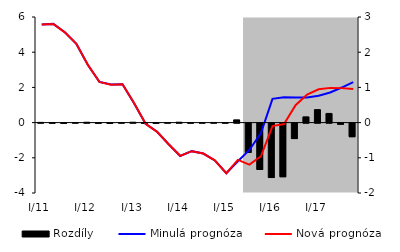
| Category | Rozdíly |
|---|---|
| 0 | 0.006 |
| 1 | -0.003 |
| 2 | -0.007 |
| 3 | 0.002 |
| 4 | 0.01 |
| 5 | -0.005 |
| 6 | -0.007 |
| 7 | 0.001 |
| 8 | 0.011 |
| 9 | -0.006 |
| 10 | -0.005 |
| 11 | 0.001 |
| 12 | 0.011 |
| 13 | -0.001 |
| 14 | 0 |
| 15 | 0.004 |
| 16 | -0.001 |
| 17 | 0.078 |
| 18 | -0.832 |
| 19 | -1.318 |
| 20 | -1.546 |
| 21 | -1.523 |
| 22 | -0.439 |
| 23 | 0.163 |
| 24 | 0.368 |
| 25 | 0.26 |
| 26 | -0.033 |
| 27 | -0.386 |